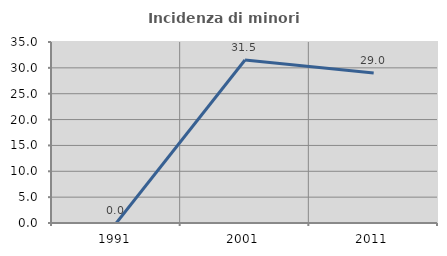
| Category | Incidenza di minori stranieri |
|---|---|
| 1991.0 | 0 |
| 2001.0 | 31.522 |
| 2011.0 | 29.018 |